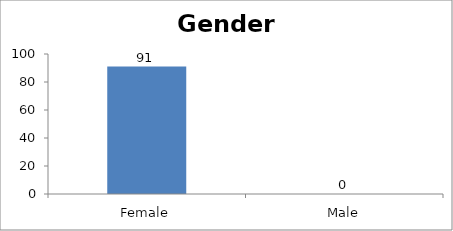
| Category | Gender |
|---|---|
| Female | 91 |
| Male | 0 |